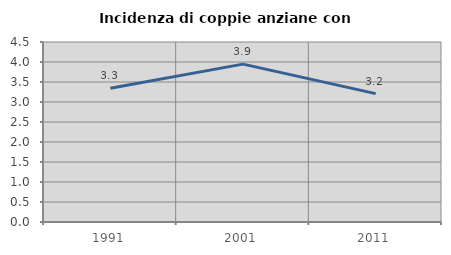
| Category | Incidenza di coppie anziane con figli |
|---|---|
| 1991.0 | 3.341 |
| 2001.0 | 3.946 |
| 2011.0 | 3.21 |